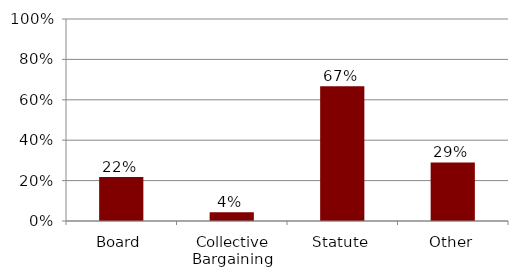
| Category | Series 0 |
|---|---|
| Board | 0.217 |
| Collective Bargaining | 0.043 |
| Statute | 0.667 |
| Other | 0.29 |